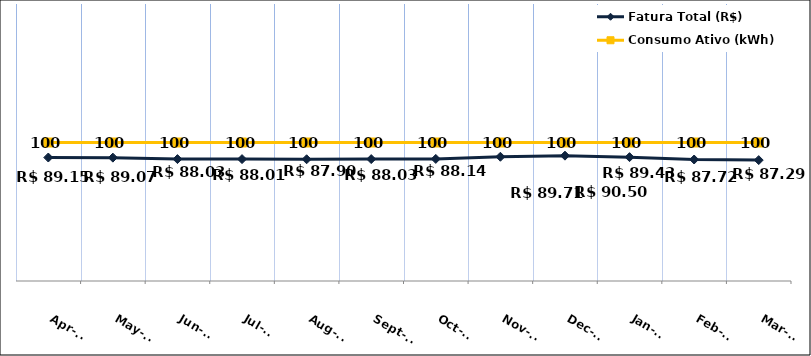
| Category | Fatura Total (R$) |
|---|---|
| 2023-04-01 | 89.15 |
| 2023-05-01 | 89.07 |
| 2023-06-01 | 88.03 |
| 2023-07-01 | 88.01 |
| 2023-08-01 | 87.9 |
| 2023-09-01 | 88.03 |
| 2023-10-01 | 88.14 |
| 2023-11-01 | 89.71 |
| 2023-12-01 | 90.5 |
| 2024-01-01 | 89.43 |
| 2024-02-01 | 87.72 |
| 2024-03-01 | 87.29 |